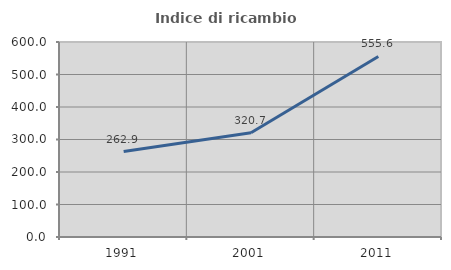
| Category | Indice di ricambio occupazionale  |
|---|---|
| 1991.0 | 262.903 |
| 2001.0 | 320.69 |
| 2011.0 | 555.556 |